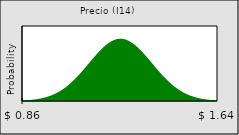
| Category | Series 0 |
|---|---|
| 0.8637209617290234 | 0 |
| nan | 0 |
| nan | 0 |
| nan | 0 |
| nan | 0 |
| nan | 0.001 |
| nan | 0.001 |
| nan | 0.001 |
| nan | 0.001 |
| nan | 0.001 |
| nan | 0.001 |
| nan | 0.001 |
| nan | 0.002 |
| nan | 0.002 |
| nan | 0.002 |
| nan | 0.002 |
| nan | 0.003 |
| nan | 0.003 |
| nan | 0.004 |
| nan | 0.004 |
| nan | 0.005 |
| nan | 0.005 |
| nan | 0.006 |
| nan | 0.006 |
| nan | 0.007 |
| nan | 0.008 |
| nan | 0.008 |
| nan | 0.009 |
| nan | 0.01 |
| nan | 0.011 |
| nan | 0.012 |
| nan | 0.013 |
| nan | 0.014 |
| nan | 0.015 |
| nan | 0.016 |
| nan | 0.017 |
| nan | 0.017 |
| nan | 0.018 |
| nan | 0.019 |
| nan | 0.02 |
| nan | 0.021 |
| nan | 0.022 |
| nan | 0.022 |
| nan | 0.023 |
| nan | 0.023 |
| nan | 0.024 |
| nan | 0.024 |
| nan | 0.025 |
| nan | 0.025 |
| nan | 0.025 |
| nan | 0.025 |
| nan | 0.025 |
| nan | 0.025 |
| nan | 0.024 |
| nan | 0.024 |
| nan | 0.023 |
| nan | 0.023 |
| nan | 0.022 |
| nan | 0.022 |
| nan | 0.021 |
| nan | 0.02 |
| nan | 0.019 |
| nan | 0.018 |
| nan | 0.017 |
| nan | 0.017 |
| nan | 0.016 |
| nan | 0.015 |
| nan | 0.014 |
| nan | 0.013 |
| nan | 0.012 |
| nan | 0.011 |
| nan | 0.01 |
| nan | 0.009 |
| nan | 0.008 |
| nan | 0.008 |
| nan | 0.007 |
| nan | 0.006 |
| nan | 0.006 |
| nan | 0.005 |
| nan | 0.005 |
| nan | 0.004 |
| nan | 0.004 |
| nan | 0.003 |
| nan | 0.003 |
| nan | 0.002 |
| nan | 0.002 |
| nan | 0.002 |
| nan | 0.002 |
| nan | 0.001 |
| nan | 0.001 |
| nan | 0.001 |
| nan | 0.001 |
| nan | 0.001 |
| nan | 0.001 |
| nan | 0.001 |
| nan | 0 |
| nan | 0 |
| nan | 0 |
| nan | 0 |
| 1.6362790382709766 | 0 |